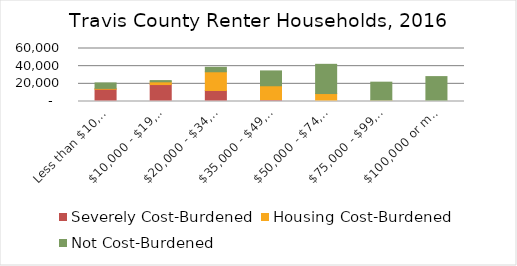
| Category | Severely Cost-Burdened | Housing Cost-Burdened | Not Cost-Burdened |
|---|---|---|---|
|   Less than $10,000 | 13936 | 895 | 6218 |
|   $10,000 - $19,999 | 19173 | 3113 | 1383 |
|   $20,000 - $34,999 | 12492 | 21173 | 5072 |
|   $35,000 - $49,999 | 2205 | 15615 | 16804 |
|   $50,000 - $74,999 | 734 | 8282 | 33070 |
|   $75,000 - $99,999 | 152 | 1218 | 20515 |
|   $100,000 or more | 0 | 494 | 27697 |